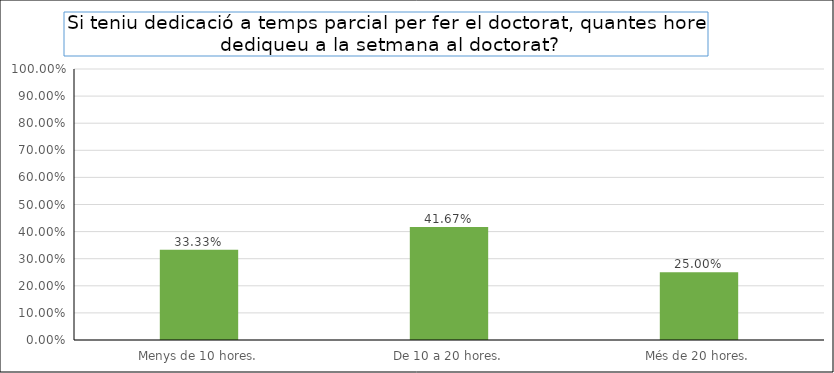
| Category | Series 0 |
|---|---|
| Menys de 10 hores. | 0.333 |
| De 10 a 20 hores. | 0.417 |
| Més de 20 hores. | 0.25 |